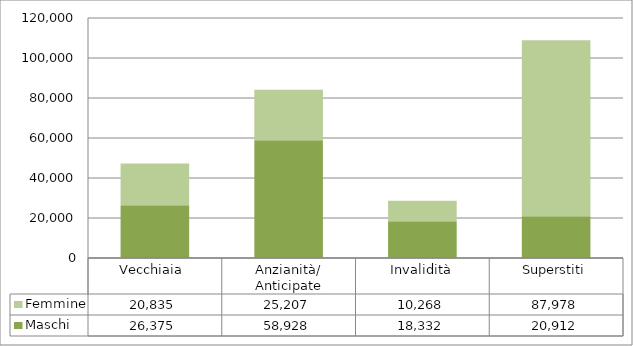
| Category | Maschi | Femmine |
|---|---|---|
| Vecchiaia  | 26375 | 20835 |
| Anzianità/ Anticipate | 58928 | 25207 |
| Invalidità | 18332 | 10268 |
| Superstiti | 20912 | 87978 |